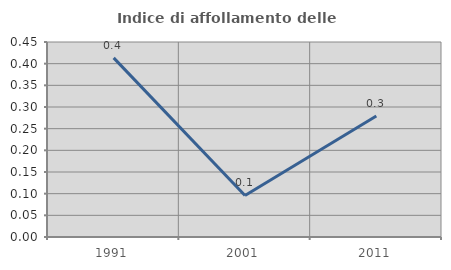
| Category | Indice di affollamento delle abitazioni  |
|---|---|
| 1991.0 | 0.413 |
| 2001.0 | 0.096 |
| 2011.0 | 0.279 |